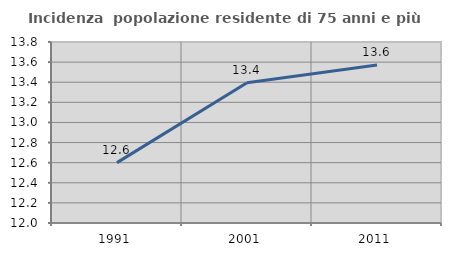
| Category | Incidenza  popolazione residente di 75 anni e più |
|---|---|
| 1991.0 | 12.601 |
| 2001.0 | 13.396 |
| 2011.0 | 13.571 |